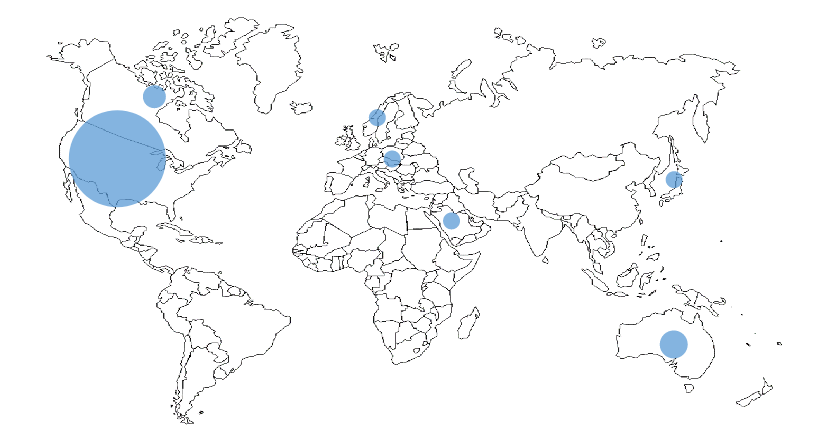
| Category | Series 0 |
|---|---|
| 0.0 | 0 |
| 1.0 | 6.5 |
| 8.5 | 2 |
| 1.5 | 8 |
| 4.7 | 6.5 |
| 8.5 | 6 |
| 5.5 | 5 |
| 4.5 | 7.5 |